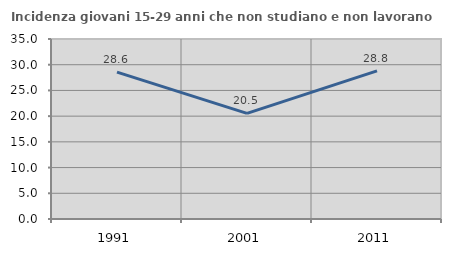
| Category | Incidenza giovani 15-29 anni che non studiano e non lavorano  |
|---|---|
| 1991.0 | 28.571 |
| 2001.0 | 20.548 |
| 2011.0 | 28.788 |